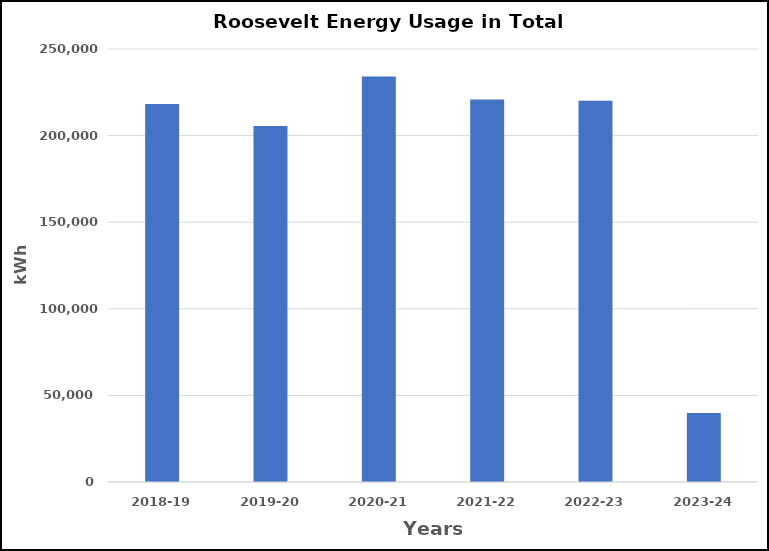
| Category | Series 0 |
|---|---|
| 2018-19 | 218211 |
| 2019-20 | 205554 |
| 2020-21 | 234144 |
| 2021-22 | 220817 |
| 2022-23 | 220142 |
| 2023-24 | 39845 |